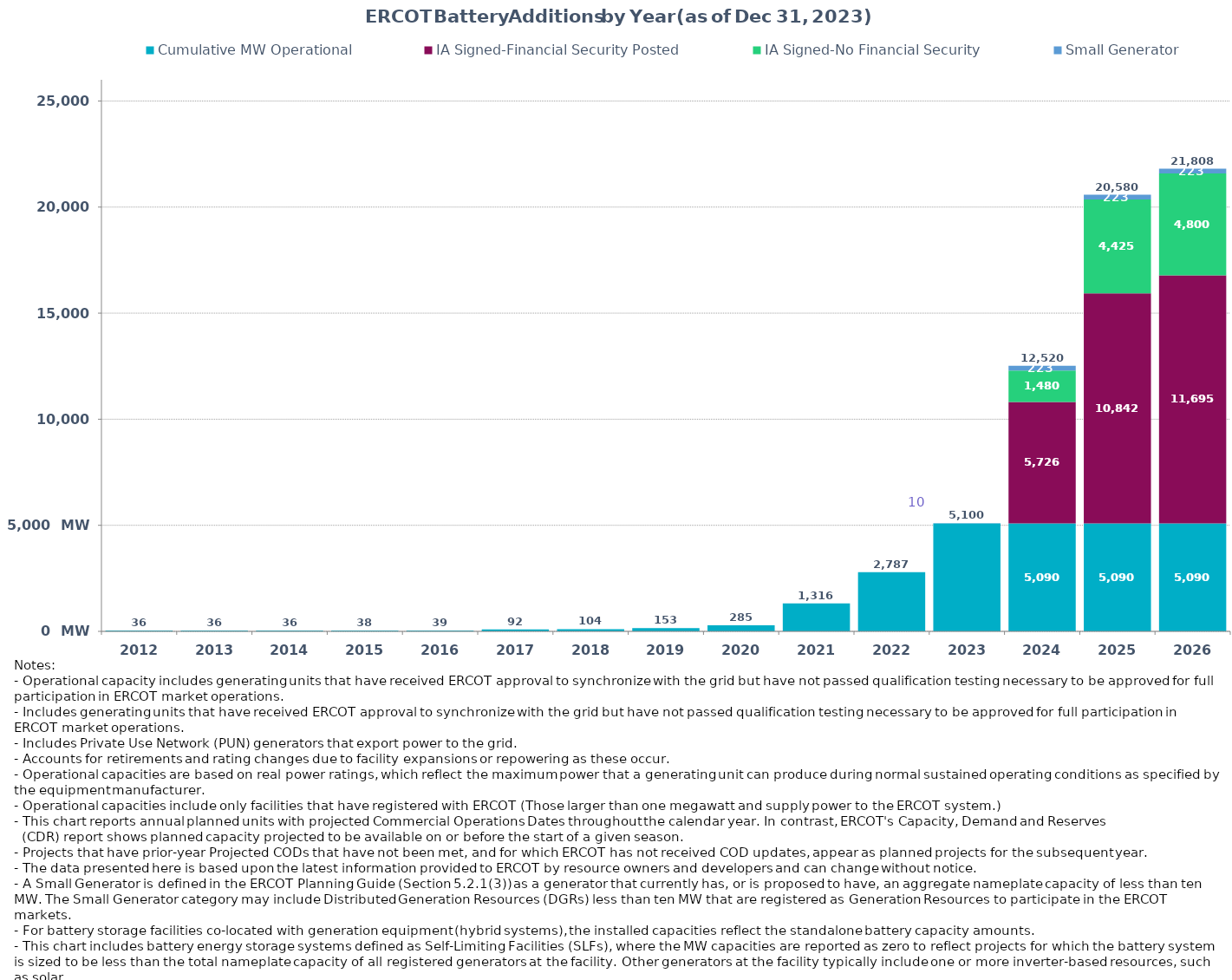
| Category | Cumulative MW Operational | IA Signed-Financial Security Posted  | IA Signed-No Financial Security  | Small Generator | Cumulative Installed and Planned |
|---|---|---|---|---|---|
| 2012.0 | 36 | 0 | 0 | 0 | 36 |
| 2013.0 | 36 | 0 | 0 | 0 | 36 |
| 2014.0 | 36 | 0 | 0 | 0 | 36 |
| 2015.0 | 38 | 0 | 0 | 0 | 38 |
| 2016.0 | 39 | 0 | 0 | 0 | 39 |
| 2017.0 | 92.3 | 0 | 0 | 0 | 92.3 |
| 2018.0 | 103.7 | 0 | 0 | 0 | 103.7 |
| 2019.0 | 153.3 | 0 | 0 | 0 | 153.3 |
| 2020.0 | 285.3 | 0 | 0 | 0 | 285.3 |
| 2021.0 | 1316.43 | 0 | 0 | 0 | 1316.43 |
| 2022.0 | 2786.86 | 0 | 0 | 0 | 2786.86 |
| 2023.0 | 5090.07 | 0 | 0 | 9.95 | 5100.02 |
| 2024.0 | 5090.07 | 5726.45 | 1480.35 | 223 | 12519.87 |
| 2025.0 | 5090.07 | 10842.31 | 4424.53 | 223 | 20579.91 |
| 2026.0 | 5090.07 | 11695.35 | 4799.72 | 223 | 21808.14 |